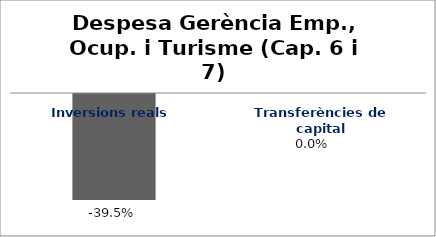
| Category | Series 0 |
|---|---|
| Inversions reals | -0.395 |
| Transferències de capital | 0 |